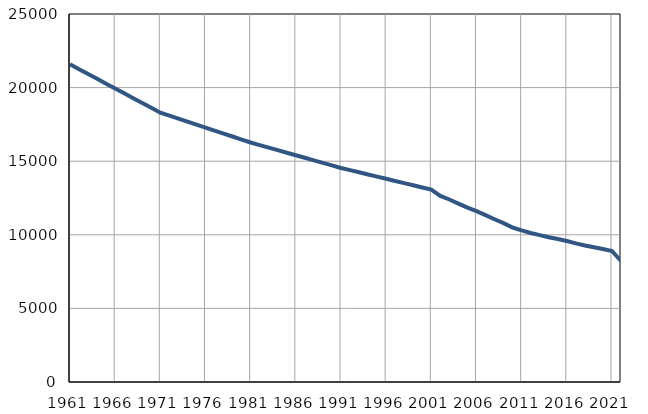
| Category | Population
size |
|---|---|
| 1961.0 | 21580 |
| 1962.0 | 21251 |
| 1963.0 | 20924 |
| 1964.0 | 20594 |
| 1965.0 | 20267 |
| 1966.0 | 19938 |
| 1967.0 | 19611 |
| 1968.0 | 19283 |
| 1969.0 | 18954 |
| 1970.0 | 18626 |
| 1971.0 | 18298 |
| 1972.0 | 18096 |
| 1973.0 | 17892 |
| 1974.0 | 17690 |
| 1975.0 | 17487 |
| 1976.0 | 17283 |
| 1977.0 | 17081 |
| 1978.0 | 16878 |
| 1979.0 | 16677 |
| 1980.0 | 16472 |
| 1981.0 | 16270 |
| 1982.0 | 16097 |
| 1983.0 | 15924 |
| 1984.0 | 15750 |
| 1985.0 | 15577 |
| 1986.0 | 15404 |
| 1987.0 | 15231 |
| 1988.0 | 15058 |
| 1989.0 | 14884 |
| 1990.0 | 14712 |
| 1991.0 | 14538 |
| 1992.0 | 14391 |
| 1993.0 | 14245 |
| 1994.0 | 14097 |
| 1995.0 | 13951 |
| 1996.0 | 13804 |
| 1997.0 | 13658 |
| 1998.0 | 13511 |
| 1999.0 | 13364 |
| 2000.0 | 13217 |
| 2001.0 | 13071 |
| 2002.0 | 12644 |
| 2003.0 | 12400 |
| 2004.0 | 12120 |
| 2005.0 | 11849 |
| 2006.0 | 11612 |
| 2007.0 | 11338 |
| 2008.0 | 11058 |
| 2009.0 | 10790 |
| 2010.0 | 10495 |
| 2011.0 | 10300 |
| 2012.0 | 10126 |
| 2013.0 | 9978 |
| 2014.0 | 9836 |
| 2015.0 | 9713 |
| 2016.0 | 9581 |
| 2017.0 | 9421 |
| 2018.0 | 9278 |
| 2019.0 | 9149 |
| 2020.0 | 9033 |
| 2021.0 | 8900 |
| 2022.0 | 8220 |